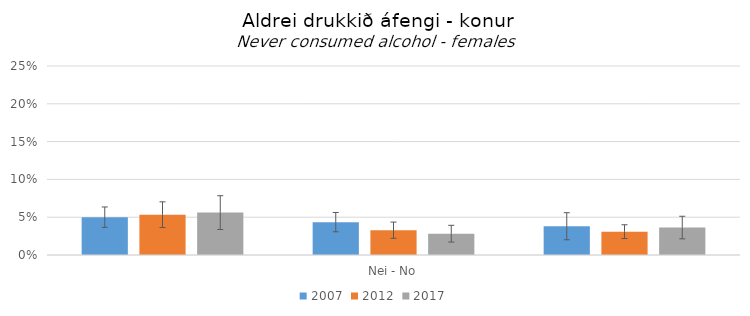
| Category | 2007 | 2012 | 2017 |
|---|---|---|---|
| 0 | 0.05 | 0.053 | 0.056 |
| 1 | 0.043 | 0.033 | 0.028 |
| 2 | 0.038 | 0.031 | 0.036 |